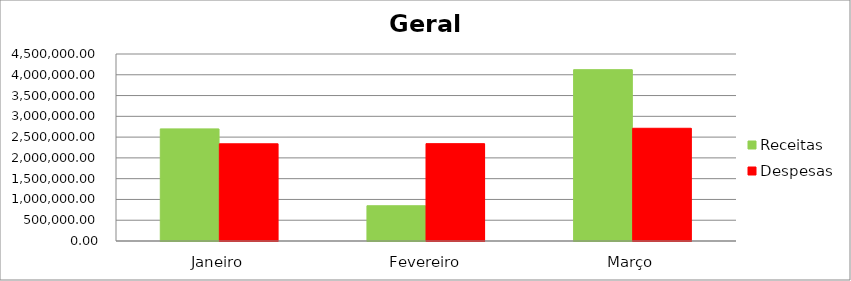
| Category | Receitas | Despesas |
|---|---|---|
| Janeiro | 2698058.06 | 2339055.74 |
| Fevereiro | 848107.96 | 2342237.57 |
| Março | 4122742.05 | 2712690.72 |